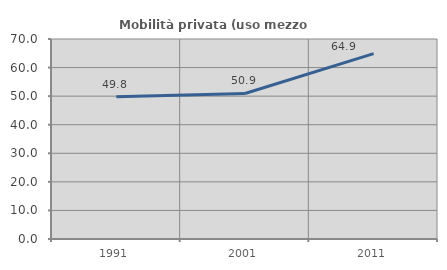
| Category | Mobilità privata (uso mezzo privato) |
|---|---|
| 1991.0 | 49.823 |
| 2001.0 | 50.932 |
| 2011.0 | 64.883 |